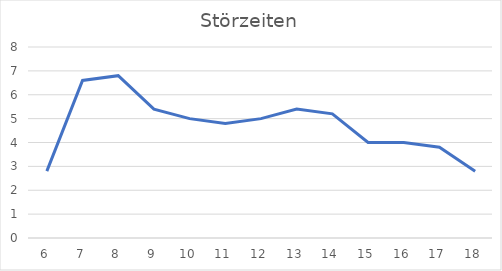
| Category | Series 0 |
|---|---|
| 6.0 | 2.8 |
| 7.0 | 6.6 |
| 8.0 | 6.8 |
| 9.0 | 5.4 |
| 10.0 | 5 |
| 11.0 | 4.8 |
| 12.0 | 5 |
| 13.0 | 5.4 |
| 14.0 | 5.2 |
| 15.0 | 4 |
| 16.0 | 4 |
| 17.0 | 3.8 |
| 18.0 | 2.8 |